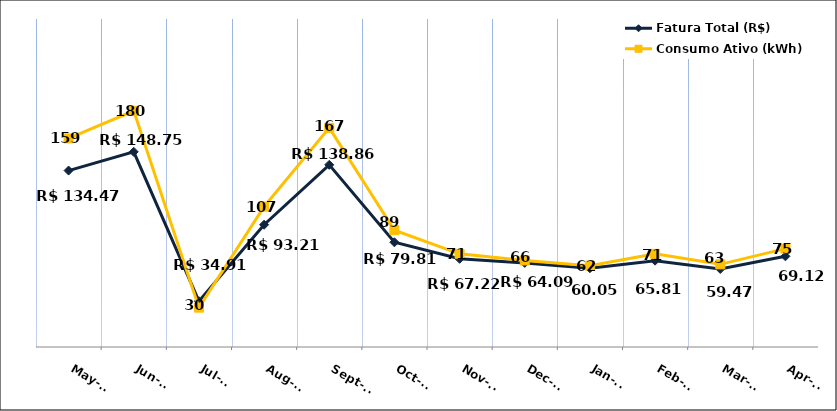
| Category | Fatura Total (R$) |
|---|---|
| 2023-05-01 | 134.47 |
| 2023-06-01 | 148.75 |
| 2023-07-01 | 34.91 |
| 2023-08-01 | 93.21 |
| 2023-09-01 | 138.86 |
| 2023-10-01 | 79.81 |
| 2023-11-01 | 67.22 |
| 2023-12-01 | 64.09 |
| 2024-01-01 | 60.05 |
| 2024-02-01 | 65.81 |
| 2024-03-01 | 59.47 |
| 2024-04-01 | 69.12 |